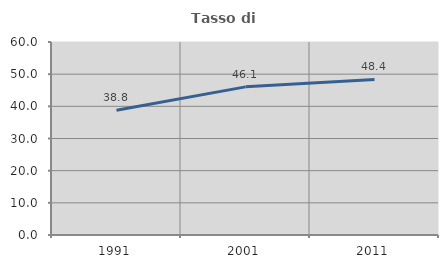
| Category | Tasso di occupazione   |
|---|---|
| 1991.0 | 38.798 |
| 2001.0 | 46.053 |
| 2011.0 | 48.379 |